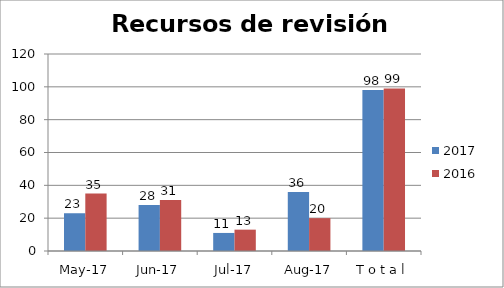
| Category | 2017 | 2016 |
|---|---|---|
| may-17 | 23 | 35 |
| jun-17 | 28 | 31 |
| jul-17 | 11 | 13 |
| ago-17 | 36 | 20 |
| T o t a l | 98 | 99 |